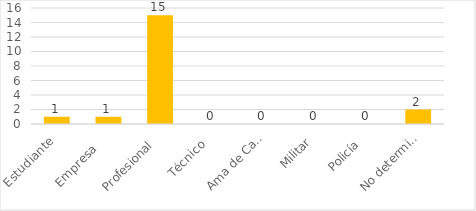
| Category | Series 0 |
|---|---|
| Estudiante | 1 |
| Empresa    | 1 |
| Profesional  | 15 |
| Técnico  | 0 |
| Ama de Casa  | 0 |
| Militar | 0 |
| Policía  | 0 |
| No determinado | 2 |